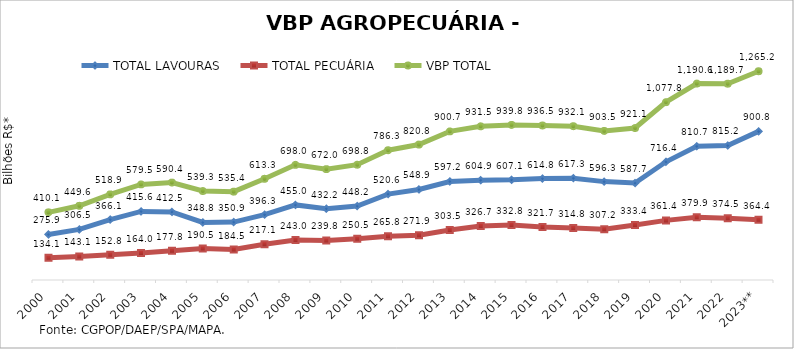
| Category | TOTAL LAVOURAS | TOTAL PECUÁRIA | VBP TOTAL |
|---|---|---|---|
| 2000 | 275.931 | 134.127 | 410.059 |
| 2001 | 306.509 | 143.097 | 449.606 |
| 2002 | 366.135 | 152.757 | 518.892 |
| 2003 | 415.561 | 163.958 | 579.519 |
| 2004 | 412.518 | 177.847 | 590.366 |
| 2005 | 348.765 | 190.518 | 539.283 |
| 2006 | 350.896 | 184.519 | 535.415 |
| 2007 | 396.273 | 217.076 | 613.349 |
| 2008 | 455.019 | 242.96 | 697.979 |
| 2009 | 432.208 | 239.8 | 672.008 |
| 2010 | 448.248 | 250.544 | 698.792 |
| 2011 | 520.584 | 265.764 | 786.348 |
| 2012 | 548.893 | 271.86 | 820.753 |
| 2013 | 597.199 | 303.499 | 900.698 |
| 2014 | 604.883 | 326.651 | 931.534 |
| 2015 | 607.077 | 332.769 | 939.846 |
| 2016 | 614.754 | 321.704 | 936.458 |
| 2017 | 617.306 | 314.791 | 932.098 |
| 2018 | 596.283 | 307.178 | 903.462 |
| 2019 | 587.708 | 333.377 | 921.085 |
| 2020 | 716.43 | 361.359 | 1077.789 |
| 2021 | 810.658 | 379.926 | 1190.584 |
| 2022 | 815.219 | 374.479 | 1189.698 |
| 2023** | 900.805 | 364.422 | 1265.227 |